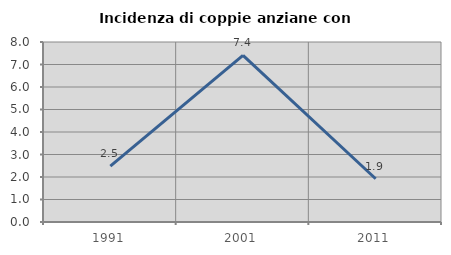
| Category | Incidenza di coppie anziane con figli |
|---|---|
| 1991.0 | 2.488 |
| 2001.0 | 7.407 |
| 2011.0 | 1.923 |